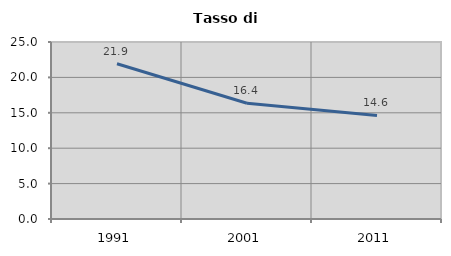
| Category | Tasso di disoccupazione   |
|---|---|
| 1991.0 | 21.93 |
| 2001.0 | 16.354 |
| 2011.0 | 14.621 |